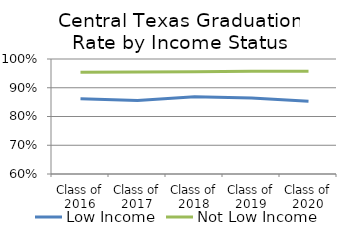
| Category | Low Income | Not Low Income |
|---|---|---|
| Class of 2016 | 0.862 | 0.954 |
| Class of 2017 | 0.856 | 0.955 |
| Class of 2018 | 0.869 | 0.956 |
| Class of 2019 | 0.864 | 0.957 |
| Class of 2020 | 0.853 | 0.957 |